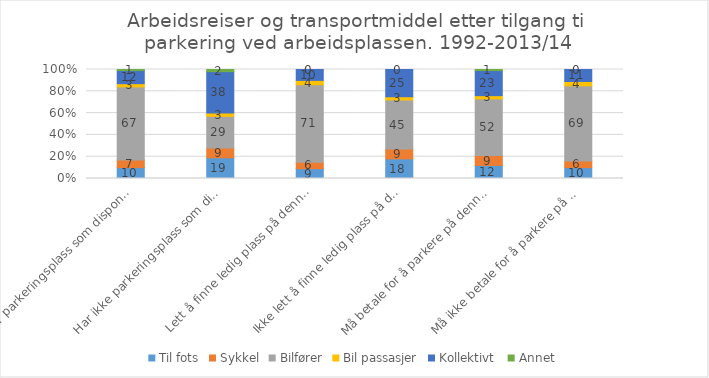
| Category | Til fots | Sykkel | Bilfører | Bil passasjer | Kollektivt  | Annet |
|---|---|---|---|---|---|---|
| Har parkeringsplass som disponeres av arbeidsgiver | 10 | 7 | 67 | 3 | 12 | 1 |
| Har ikke parkeringsplass som disponeres av arbeidsgiver | 19 | 9 | 29 | 3 | 38 | 2 |
| Lett å finne ledig plass på denne parkeringsplassen | 9 | 6 | 71 | 4 | 10 | 0 |
| Ikke lett å finne ledig plass på denne parkeringsplassen | 18 | 9 | 45 | 3 | 25 | 0 |
| Må betale for å parkere på denne plassen | 12 | 9 | 52 | 3 | 23 | 1 |
| Må ikke betale for å parkere på denne plassen | 10 | 6 | 69 | 4 | 11 | 0 |